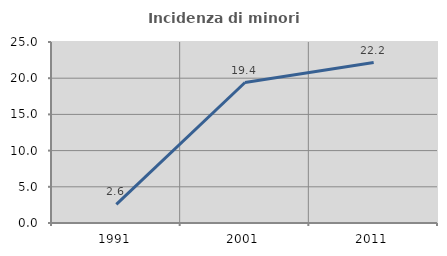
| Category | Incidenza di minori stranieri |
|---|---|
| 1991.0 | 2.564 |
| 2001.0 | 19.403 |
| 2011.0 | 22.159 |